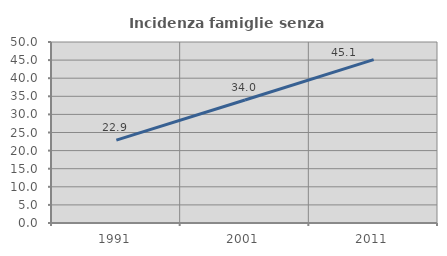
| Category | Incidenza famiglie senza nuclei |
|---|---|
| 1991.0 | 22.892 |
| 2001.0 | 33.992 |
| 2011.0 | 45.149 |